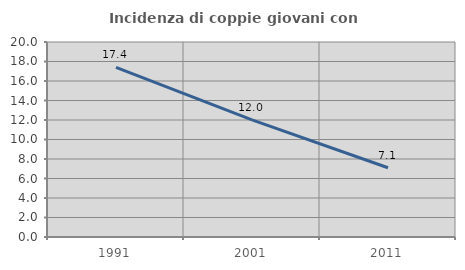
| Category | Incidenza di coppie giovani con figli |
|---|---|
| 1991.0 | 17.404 |
| 2001.0 | 12.008 |
| 2011.0 | 7.105 |